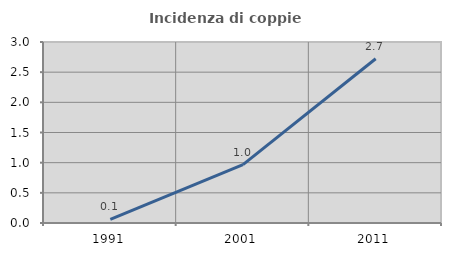
| Category | Incidenza di coppie miste |
|---|---|
| 1991.0 | 0.062 |
| 2001.0 | 0.968 |
| 2011.0 | 2.722 |